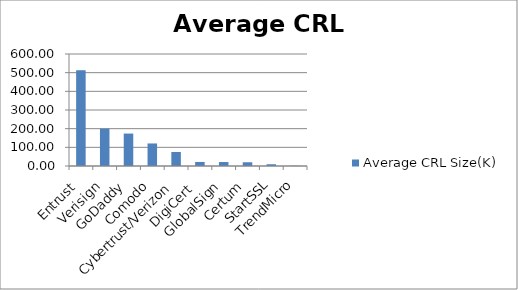
| Category | Average CRL Size(K) |
|---|---|
| Entrust | 512.333 |
| Verisign | 200.04 |
| GoDaddy | 173.793 |
| Comodo | 120.75 |
| Cybertrust/Verizon | 75 |
| DigiCert  | 21.66 |
| GlobalSign | 21.25 |
| Certum | 20 |
| StartSSL | 9.4 |
| TrendMicro | 1 |